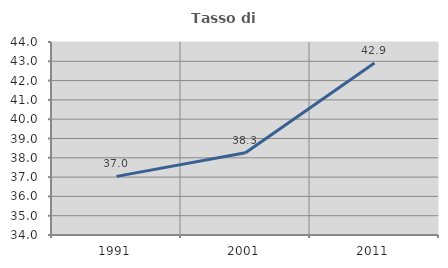
| Category | Tasso di occupazione   |
|---|---|
| 1991.0 | 37.038 |
| 2001.0 | 38.257 |
| 2011.0 | 42.915 |